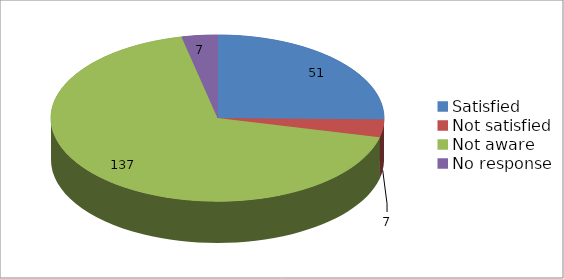
| Category | Series 0 |
|---|---|
| Satisfied | 51 |
| Not satisfied | 7 |
| Not aware | 137 |
| No response | 7 |